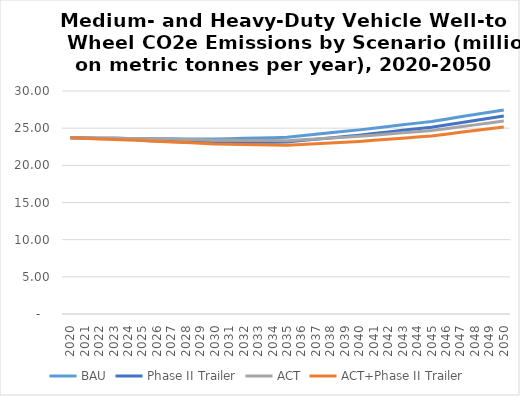
| Category | BAU | Phase II Trailer | ACT | ACT+Phase II Trailer |
|---|---|---|---|---|
| 2020.0 | 23.7 | 23.7 | 23.7 | 23.7 |
| 2021.0 | 23.679 | 23.679 | 23.679 | 23.628 |
| 2022.0 | 23.658 | 23.658 | 23.658 | 23.555 |
| 2023.0 | 23.637 | 23.637 | 23.637 | 23.483 |
| 2024.0 | 23.616 | 23.616 | 23.616 | 23.411 |
| 2025.0 | 23.596 | 23.351 | 23.583 | 23.339 |
| 2026.0 | 23.583 | 23.286 | 23.583 | 23.247 |
| 2027.0 | 23.571 | 23.22 | 23.534 | 23.155 |
| 2028.0 | 23.558 | 23.154 | 23.485 | 23.063 |
| 2029.0 | 23.546 | 23.088 | 23.436 | 22.971 |
| 2030.0 | 23.533 | 23.023 | 23.387 | 22.879 |
| 2031.0 | 23.582 | 23.047 | 23.372 | 22.842 |
| 2032.0 | 23.63 | 23.071 | 23.357 | 22.805 |
| 2033.0 | 23.678 | 23.095 | 23.342 | 22.767 |
| 2034.0 | 23.726 | 23.118 | 23.328 | 22.73 |
| 2035.0 | 23.775 | 23.142 | 23.313 | 22.692 |
| 2036.0 | 23.974 | 23.326 | 23.43 | 22.796 |
| 2037.0 | 24.173 | 23.509 | 23.547 | 22.9 |
| 2038.0 | 24.372 | 23.692 | 23.665 | 23.004 |
| 2039.0 | 24.571 | 23.875 | 23.782 | 23.108 |
| 2040.0 | 24.77 | 24.058 | 23.9 | 23.212 |
| 2041.0 | 24.997 | 24.274 | 24.056 | 23.359 |
| 2042.0 | 25.223 | 24.489 | 24.212 | 23.506 |
| 2043.0 | 25.45 | 24.705 | 24.368 | 23.653 |
| 2044.0 | 25.677 | 24.921 | 24.524 | 23.8 |
| 2045.0 | 25.904 | 25.136 | 24.68 | 23.947 |
| 2046.0 | 26.214 | 25.436 | 24.933 | 24.192 |
| 2047.0 | 26.524 | 25.735 | 25.187 | 24.437 |
| 2048.0 | 26.834 | 26.034 | 25.441 | 24.682 |
| 2049.0 | 27.144 | 26.333 | 25.695 | 24.926 |
| 2050.0 | 27.453 | 26.632 | 25.949 | 25.171 |